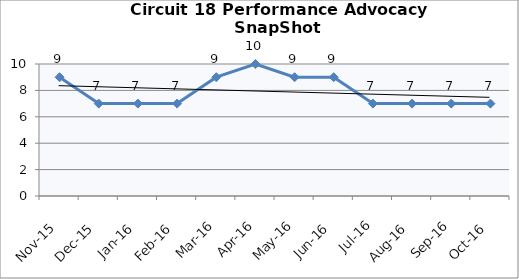
| Category | Circuit 18 |
|---|---|
| Nov-15 | 9 |
| Dec-15 | 7 |
| Jan-16 | 7 |
| Feb-16 | 7 |
| Mar-16 | 9 |
| Apr-16 | 10 |
| May-16 | 9 |
| Jun-16 | 9 |
| Jul-16 | 7 |
| Aug-16 | 7 |
| Sep-16 | 7 |
| Oct-16 | 7 |